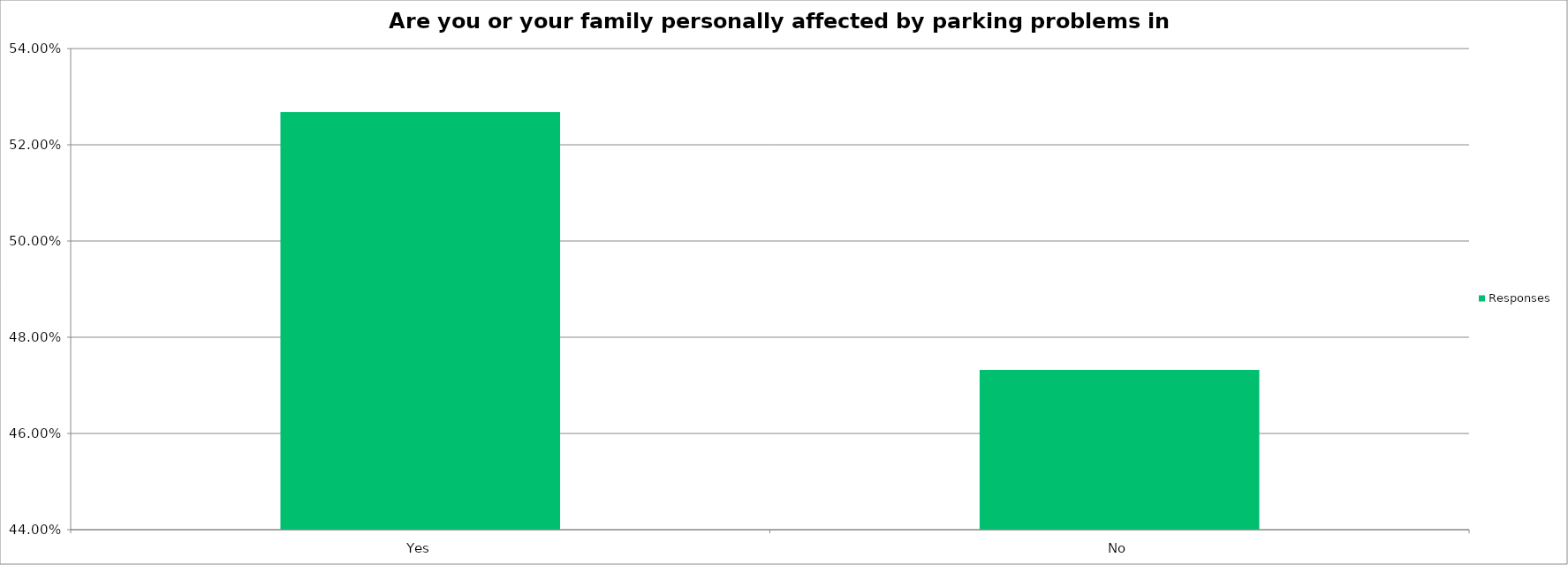
| Category | Responses |
|---|---|
| Yes | 0.527 |
| No | 0.473 |